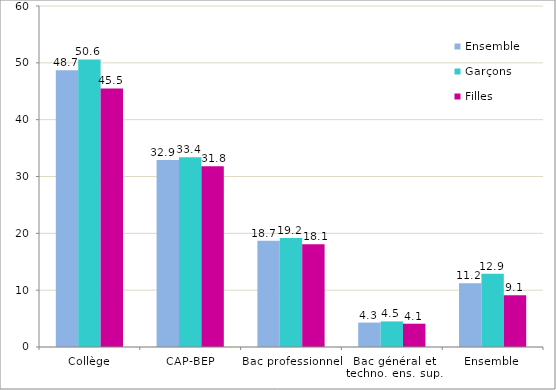
| Category | Ensemble | Garçons | Filles |
|---|---|---|---|
| Collège | 48.7 | 50.6 | 45.5 |
| CAP-BEP | 32.9 | 33.4 | 31.8 |
| Bac professionnel | 18.7 | 19.2 | 18.1 |
| Bac général et techno. ens. sup. | 4.3 | 4.5 | 4.1 |
| Ensemble | 11.2 | 12.9 | 9.1 |